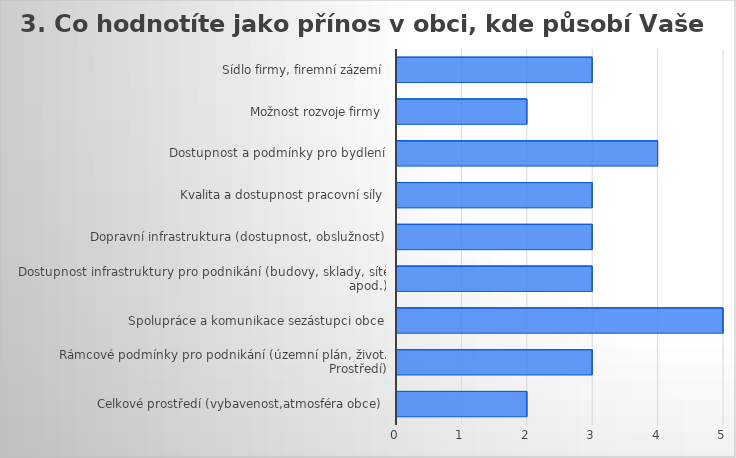
| Category | Series 0 |
|---|---|
| Celkové prostředí (vybavenost,atmosféra obce) | 2 |
| Rámcové podmínky pro podnikání (územní plán, život. Prostředí) | 3 |
| Spolupráce a komunikace sezástupci obce | 5 |
| Dostupnost infrastruktury pro podnikání (budovy, sklady, sítě apod.) | 3 |
| Dopravní infrastruktura (dostupnost, obslužnost) | 3 |
| Kvalita a dostupnost pracovní síly | 3 |
| Dostupnost a podmínky pro bydlení | 4 |
| Možnost rozvoje firmy | 2 |
| Sídlo firmy, firemní zázemí | 3 |